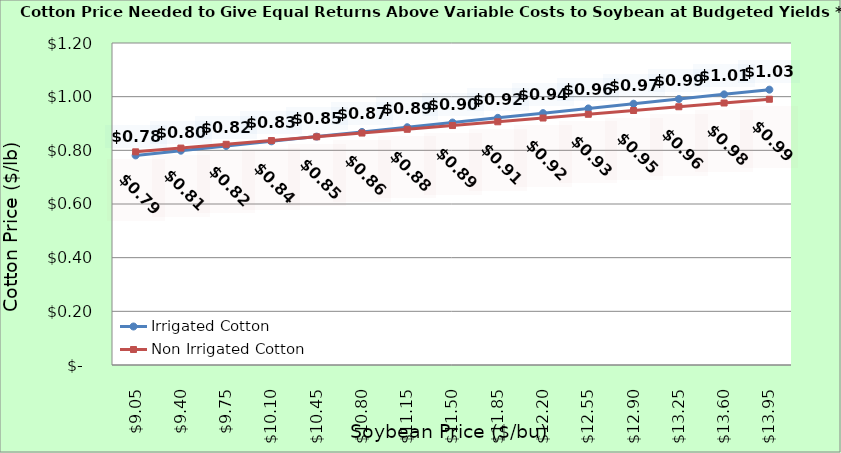
| Category | Irrigated Cotton | Non Irrigated Cotton |
|---|---|---|
| 9.050000000000002 | 0.781 | 0.794 |
| 9.400000000000002 | 0.799 | 0.808 |
| 9.750000000000002 | 0.816 | 0.822 |
| 10.100000000000001 | 0.834 | 0.836 |
| 10.450000000000001 | 0.851 | 0.85 |
| 10.8 | 0.869 | 0.864 |
| 11.15 | 0.886 | 0.878 |
| 11.5 | 0.904 | 0.892 |
| 11.85 | 0.921 | 0.906 |
| 12.2 | 0.939 | 0.92 |
| 12.549999999999999 | 0.956 | 0.934 |
| 12.899999999999999 | 0.974 | 0.948 |
| 13.249999999999998 | 0.991 | 0.962 |
| 13.599999999999998 | 1.009 | 0.976 |
| 13.949999999999998 | 1.026 | 0.99 |